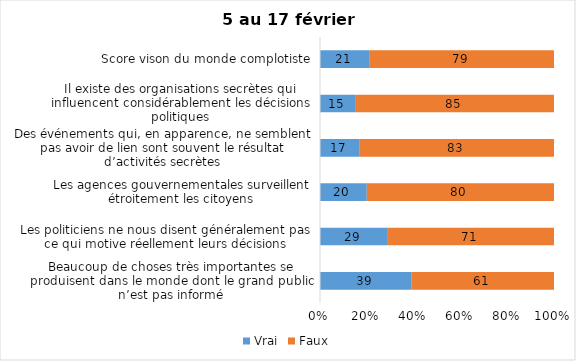
| Category | Vrai | Faux |
|---|---|---|
| Beaucoup de choses très importantes se produisent dans le monde dont le grand public n’est pas informé | 39 | 61 |
| Les politiciens ne nous disent généralement pas ce qui motive réellement leurs décisions | 29 | 71 |
| Les agences gouvernementales surveillent étroitement les citoyens | 20 | 80 |
| Des événements qui, en apparence, ne semblent pas avoir de lien sont souvent le résultat d’activités secrètes | 17 | 83 |
| Il existe des organisations secrètes qui influencent considérablement les décisions politiques | 15 | 85 |
| Score vison du monde complotiste | 21 | 79 |